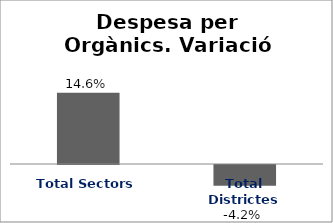
| Category | Series 0 |
|---|---|
| Total Sectors | 0.146 |
| Total Districtes | -0.042 |